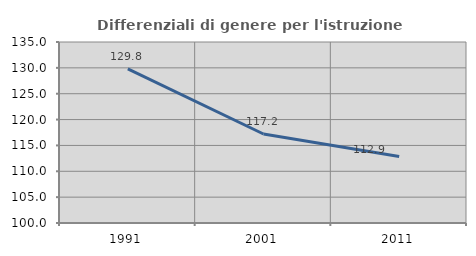
| Category | Differenziali di genere per l'istruzione superiore |
|---|---|
| 1991.0 | 129.804 |
| 2001.0 | 117.212 |
| 2011.0 | 112.863 |